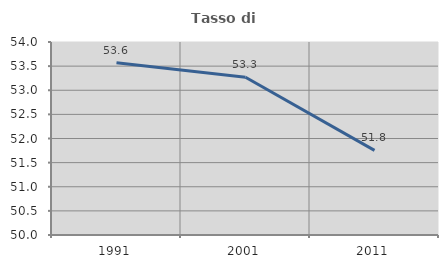
| Category | Tasso di occupazione   |
|---|---|
| 1991.0 | 53.569 |
| 2001.0 | 53.27 |
| 2011.0 | 51.753 |